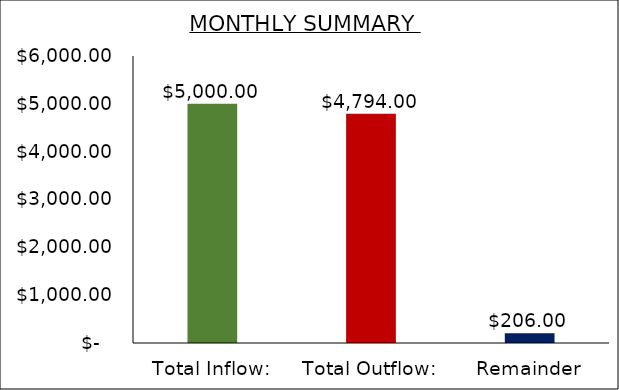
| Category | Series 0 |
|---|---|
| Total Inflow: | 5000 |
| Total Outflow: | 4794 |
| Remainder | 206 |